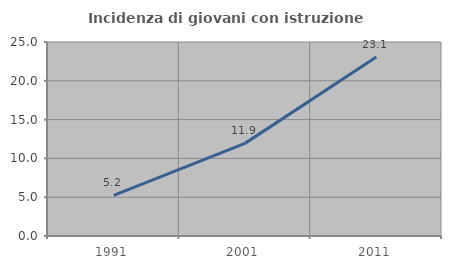
| Category | Incidenza di giovani con istruzione universitaria |
|---|---|
| 1991.0 | 5.234 |
| 2001.0 | 11.936 |
| 2011.0 | 23.052 |